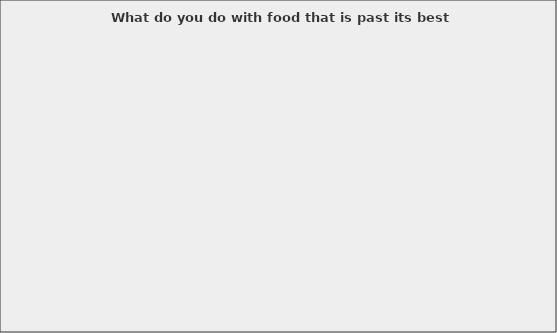
| Category | Series 0 |
|---|---|
| We put it in the rubbish. | 0.471 |
| We put some in the rubbish and we feed animals with the rest. | 0.118 |
| We put some in the rubbish and we eat the food we think is still safe to eat. | 0.363 |
| We consume it all; we do not pay attention to best before dates. | 0.02 |
| We compost suitable food waste. | 0.118 |
| We do something different to the above suggestions. | 0 |
| Other (please specify) | 0.02 |